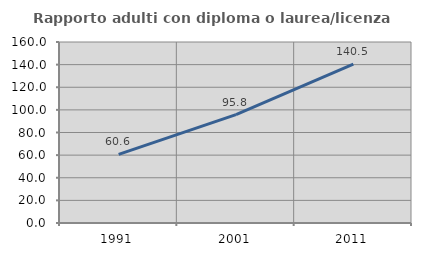
| Category | Rapporto adulti con diploma o laurea/licenza media  |
|---|---|
| 1991.0 | 60.635 |
| 2001.0 | 95.758 |
| 2011.0 | 140.548 |